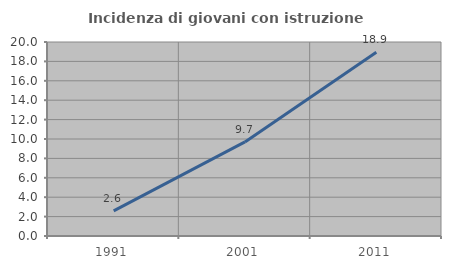
| Category | Incidenza di giovani con istruzione universitaria |
|---|---|
| 1991.0 | 2.586 |
| 2001.0 | 9.701 |
| 2011.0 | 18.939 |